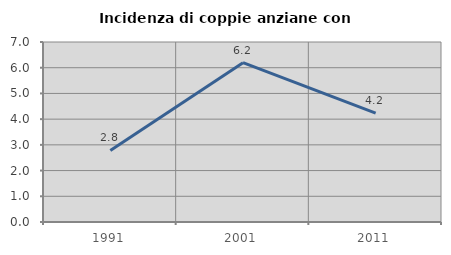
| Category | Incidenza di coppie anziane con figli |
|---|---|
| 1991.0 | 2.785 |
| 2001.0 | 6.197 |
| 2011.0 | 4.235 |